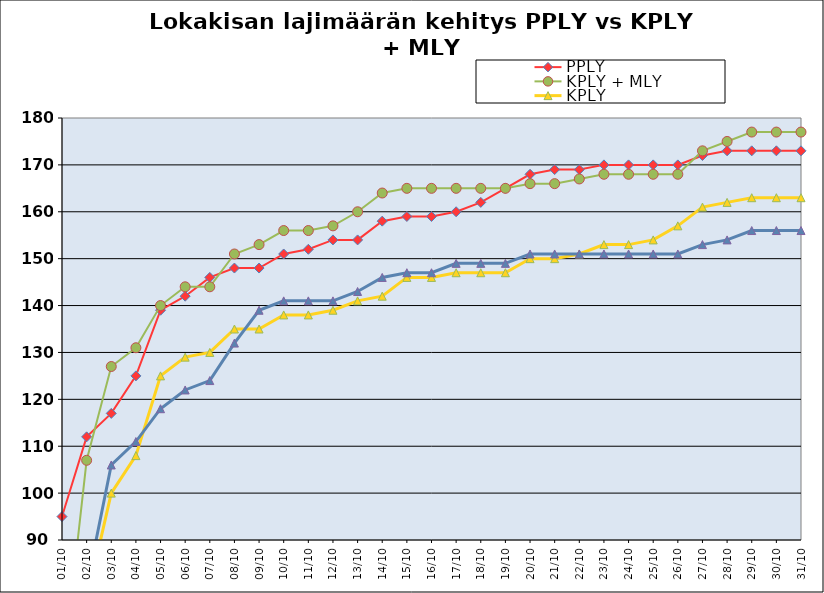
| Category | PPLY | KPLY + MLY | KPLY | MLY |
|---|---|---|---|---|
| 01.10 | 95 | 60 | 31 | 43 |
| 02.10 | 112 | 107 | 77 | 80 |
| 03.10 | 117 | 127 | 100 | 106 |
| 04.10 | 125 | 131 | 108 | 111 |
| 05.10 | 139 | 140 | 125 | 118 |
| 06.10 | 142 | 144 | 129 | 122 |
| 07.10 | 146 | 144 | 130 | 124 |
| 08.10 | 148 | 151 | 135 | 132 |
| 09.10 | 148 | 153 | 135 | 139 |
| 10.10 | 151 | 156 | 138 | 141 |
| 11.10 | 152 | 156 | 138 | 141 |
| 12.10 | 154 | 157 | 139 | 141 |
| 13.10 | 154 | 160 | 141 | 143 |
| 14.10 | 158 | 164 | 142 | 146 |
| 15.10 | 159 | 165 | 146 | 147 |
| 16.10 | 159 | 165 | 146 | 147 |
| 17.10 | 160 | 165 | 147 | 149 |
| 18.10 | 162 | 165 | 147 | 149 |
| 19.10 | 165 | 165 | 147 | 149 |
| 20.10 | 168 | 166 | 150 | 151 |
| 21.10 | 169 | 166 | 150 | 151 |
| 22.10 | 169 | 167 | 151 | 151 |
| 23.10 | 170 | 168 | 153 | 151 |
| 24.10 | 170 | 168 | 153 | 151 |
| 25.10 | 170 | 168 | 154 | 151 |
| 26.10 | 170 | 168 | 157 | 151 |
| 27.10 | 172 | 173 | 161 | 153 |
| 28.10 | 173 | 175 | 162 | 154 |
| 29.10 | 173 | 177 | 163 | 156 |
| 30.10 | 173 | 177 | 163 | 156 |
| 31.10 | 173 | 177 | 163 | 156 |